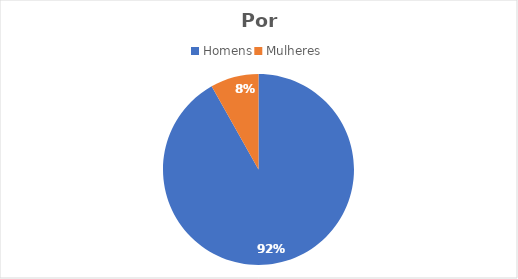
| Category | Series 0 |
|---|---|
| Homens | 45 |
| Mulheres | 4 |